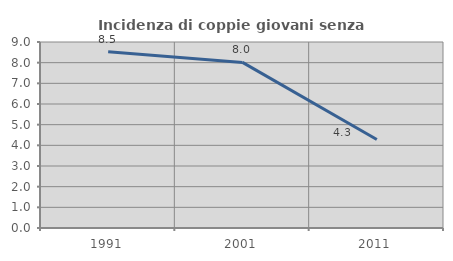
| Category | Incidenza di coppie giovani senza figli |
|---|---|
| 1991.0 | 8.524 |
| 2001.0 | 8.013 |
| 2011.0 | 4.286 |